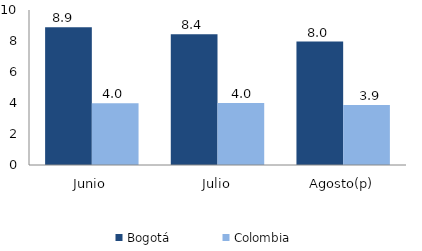
| Category | Bogotá | Colombia |
|---|---|---|
| Junio | 8.893 | 3.987 |
| Julio | 8.442 | 3.996 |
| Agosto(p) | 7.964 | 3.876 |